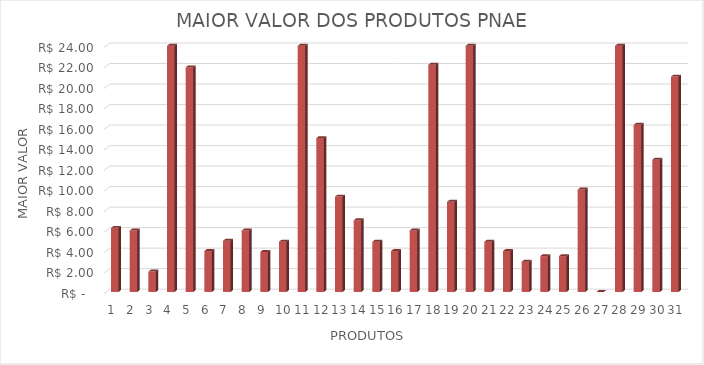
| Category | Series 0 |
|---|---|
| 0 | 6.25 |
| 1 | 5.99 |
| 2 | 1.99 |
| 3 | 24 |
| 4 | 21.9 |
| 5 | 3.99 |
| 6 | 4.99 |
| 7 | 5.99 |
| 8 | 3.9 |
| 9 | 4.9 |
| 10 | 29.75 |
| 11 | 15 |
| 12 | 9.3 |
| 13 | 6.99 |
| 14 | 4.9 |
| 15 | 3.99 |
| 16 | 6 |
| 17 | 22.15 |
| 18 | 8.79 |
| 19 | 49.95 |
| 20 | 4.9 |
| 21 | 3.99 |
| 22 | 2.95 |
| 23 | 3.5 |
| 24 | 3.5 |
| 25 | 9.99 |
| 26 | 0 |
| 27 | 42 |
| 28 | 16.3 |
| 29 | 12.9 |
| 30 | 21 |